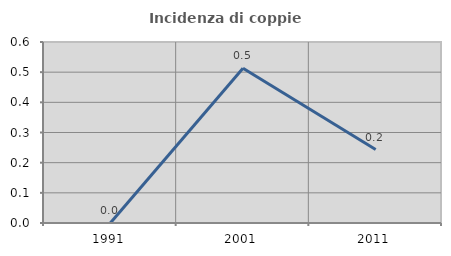
| Category | Incidenza di coppie miste |
|---|---|
| 1991.0 | 0 |
| 2001.0 | 0.513 |
| 2011.0 | 0.244 |